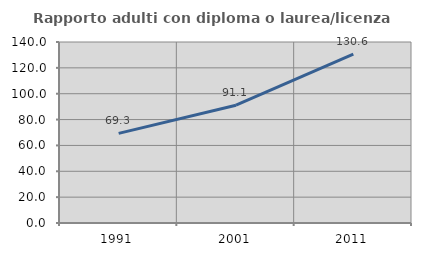
| Category | Rapporto adulti con diploma o laurea/licenza media  |
|---|---|
| 1991.0 | 69.308 |
| 2001.0 | 91.096 |
| 2011.0 | 130.591 |